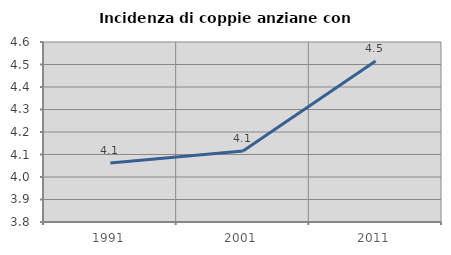
| Category | Incidenza di coppie anziane con figli |
|---|---|
| 1991.0 | 4.062 |
| 2001.0 | 4.115 |
| 2011.0 | 4.515 |